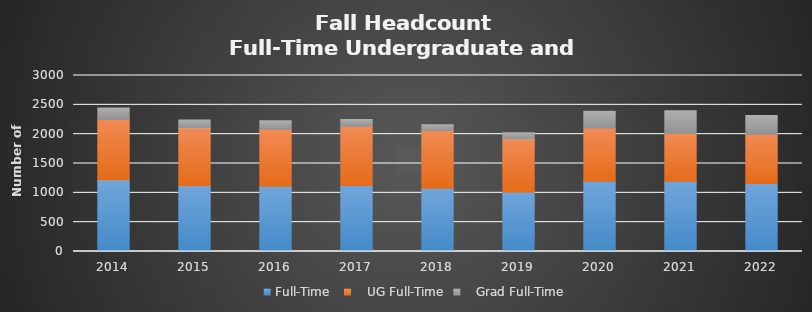
| Category | Full-Time  |    UG Full-Time |    Grad Full-Time |
|---|---|---|---|
| 2014.0 | 1224 | 1028 | 196 |
| 2015.0 | 1121 | 986 | 135 |
| 2016.0 | 1114 | 970 | 144 |
| 2017.0 | 1124 | 1009 | 115 |
| 2018.0 | 1080 | 982 | 98 |
| 2019.0 | 1013 | 906 | 107 |
| 2020.0 | 1196 | 907 | 289 |
| 2021.0 | 1199 | 815 | 384 |
| 2022.0 | 1159 | 838 | 321 |